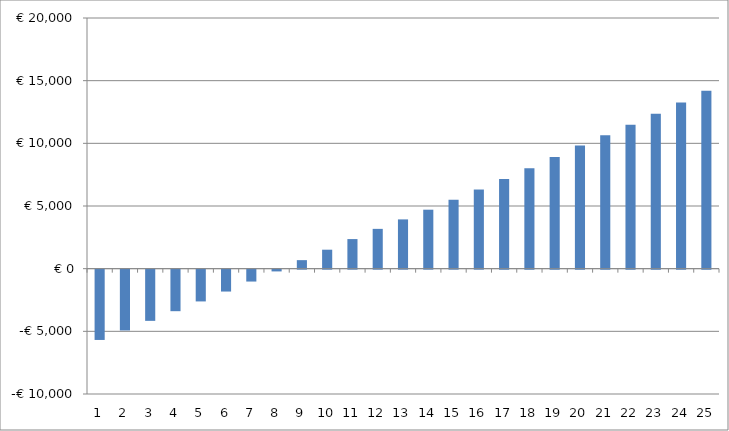
| Category | Series 0 |
|---|---|
| 0 | -3872.103 |
| 1 | -3399.614 |
| 2 | -2919.853 |
| 3 | -2432.074 |
| 4 | -1935.489 |
| 5 | -1429.263 |
| 6 | -912.508 |
| 7 | -384.285 |
| 8 | 156.403 |
| 9 | 710.612 |
| 10 | 1279.464 |
| 11 | 1831.946 |
| 12 | 2350.919 |
| 13 | 2888.32 |
| 14 | 3445.568 |
| 15 | 4024.167 |
| 16 | 4625.712 |
| 17 | 5251.897 |
| 18 | 5907.144 |
| 19 | 6599.863 |
| 20 | 7183.226 |
| 21 | 7804.451 |
| 22 | 8465.842 |
| 23 | 9169.841 |
| 24 | 9919.037 |